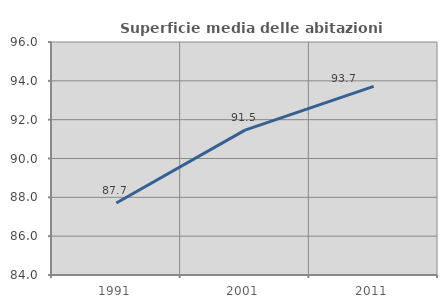
| Category | Superficie media delle abitazioni occupate |
|---|---|
| 1991.0 | 87.711 |
| 2001.0 | 91.462 |
| 2011.0 | 93.714 |